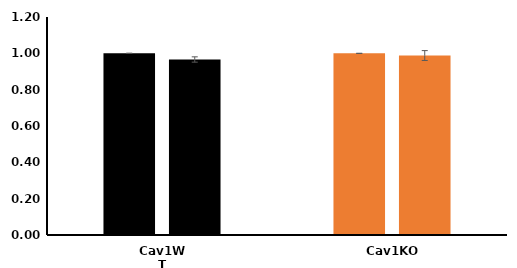
| Category | Control | Rab11DN |
|---|---|---|
| Cav1WT | 1 | 0.966 |
| Cav1KO | 1 | 0.988 |